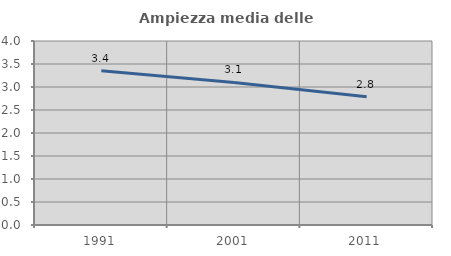
| Category | Ampiezza media delle famiglie |
|---|---|
| 1991.0 | 3.353 |
| 2001.0 | 3.098 |
| 2011.0 | 2.79 |